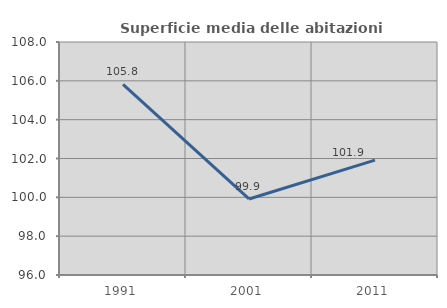
| Category | Superficie media delle abitazioni occupate |
|---|---|
| 1991.0 | 105.821 |
| 2001.0 | 99.916 |
| 2011.0 | 101.914 |